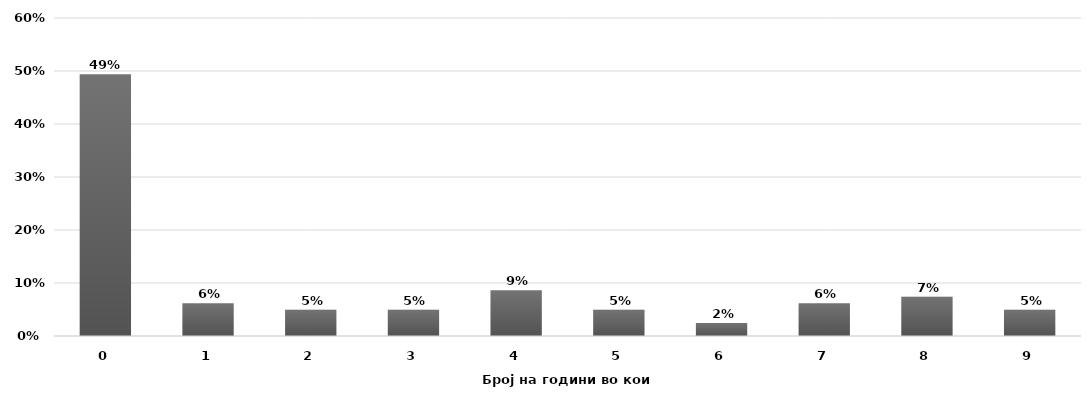
| Category | % по фреквенција  |
|---|---|
| 0.0 | 0.494 |
| 1.0 | 0.062 |
| 2.0 | 0.049 |
| 3.0 | 0.049 |
| 4.0 | 0.086 |
| 5.0 | 0.049 |
| 6.0 | 0.025 |
| 7.0 | 0.062 |
| 8.0 | 0.074 |
| 9.0 | 0.049 |